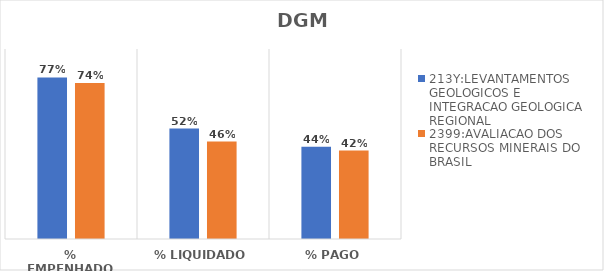
| Category | 213Y:LEVANTAMENTOS GEOLOGICOS E INTEGRACAO GEOLOGICA REGIONAL | 2399:AVALIACAO DOS RECURSOS MINERAIS DO BRASIL |
|---|---|---|
| % EMPENHADO | 0.765 | 0.739 |
| % LIQUIDADO | 0.523 | 0.461 |
| % PAGO | 0.437 | 0.419 |